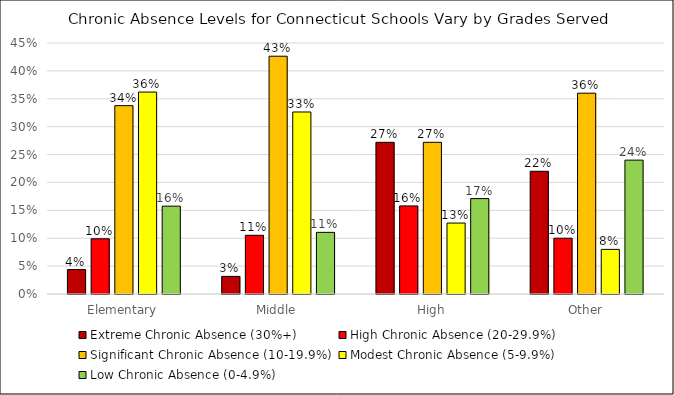
| Category | Extreme Chronic Absence (30%+) | High Chronic Absence (20-29.9%) | Significant Chronic Absence (10-19.9%) | Modest Chronic Absence (5-9.9%) | Low Chronic Absence (0-4.9%) |
|---|---|---|---|---|---|
| Elementary | 0.044 | 0.099 | 0.338 | 0.362 | 0.157 |
| Middle | 0.032 | 0.105 | 0.426 | 0.326 | 0.111 |
| High | 0.272 | 0.158 | 0.272 | 0.127 | 0.171 |
| Other | 0.22 | 0.1 | 0.36 | 0.08 | 0.24 |